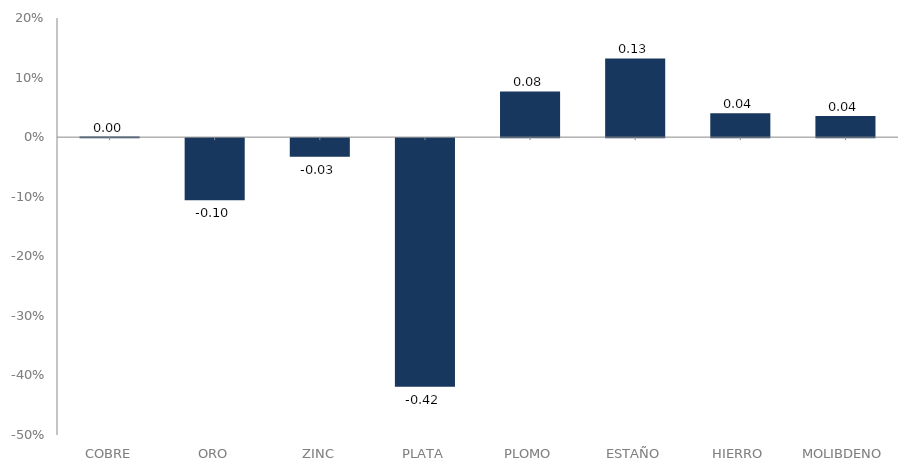
| Category | serie |
|---|---|
| 0 | 0.001 |
| 1 | -0.104 |
| 2 | -0.031 |
| 3 | -0.417 |
| 4 | 0.077 |
| 5 | 0.132 |
| 6 | 0.04 |
| 7 | 0.035 |